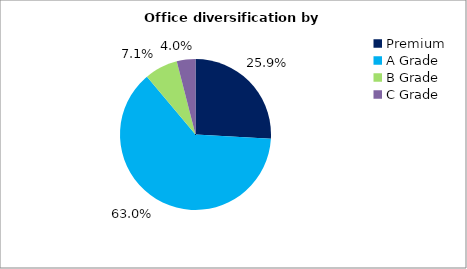
| Category | Series 0 |
|---|---|
| Premium | 0.259 |
| A Grade | 0.63 |
| B Grade | 0.071 |
| C Grade | 0.04 |